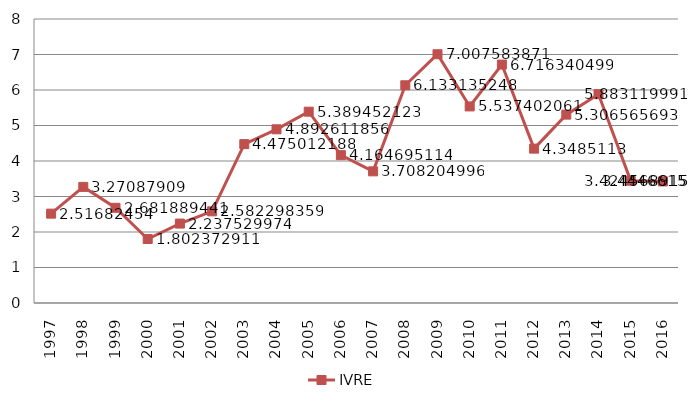
| Category | IVRE |
|---|---|
| 1997.0 | 2.517 |
| 1998.0 | 3.271 |
| 1999.0 | 2.682 |
| 2000.0 | 1.802 |
| 2001.0 | 2.238 |
| 2002.0 | 2.582 |
| 2003.0 | 4.475 |
| 2004.0 | 4.893 |
| 2005.0 | 5.389 |
| 2006.0 | 4.165 |
| 2007.0 | 3.708 |
| 2008.0 | 6.133 |
| 2009.0 | 7.008 |
| 2010.0 | 5.537 |
| 2011.0 | 6.716 |
| 2012.0 | 4.349 |
| 2013.0 | 5.307 |
| 2014.0 | 5.883 |
| 2015.0 | 3.445 |
| 2016.0 | 3.425 |